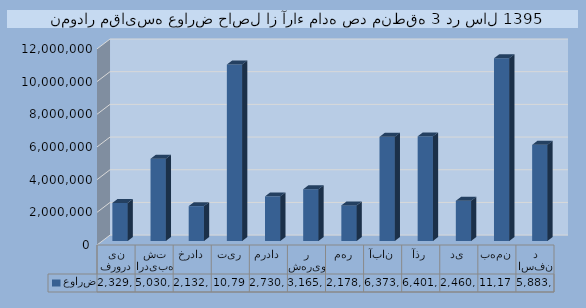
| Category | عوارض |
|---|---|
| فروردین | 2329080 |
| اردیبهشت | 5030658 |
| خرداد | 2132624 |
| تیر | 10796137 |
| مرداد | 2730574 |
| شهریور | 3165670 |
| مهر | 2178101 |
| آبان | 6373348 |
| آذر | 6401072 |
| دی | 2460155 |
| بهمن | 11178588 |
| اسفند | 5883164 |